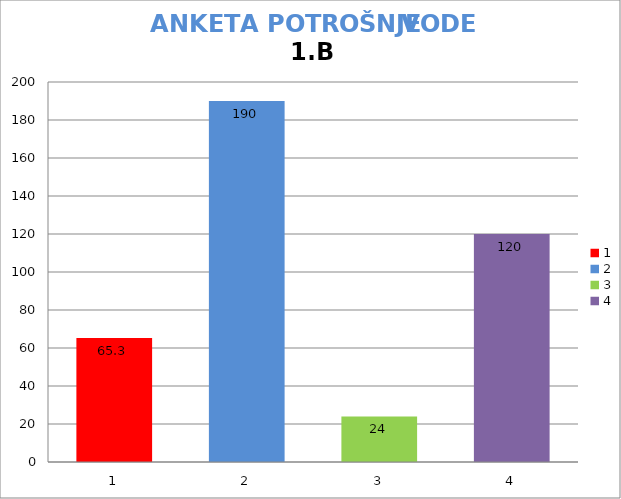
| Category | prosječna potrošnja | stvarna potrošnja | minimalna potrošnja | maksimalna potrošnja |
|---|---|---|---|---|
| 0 | 65.3 |  |  |  |
| 1 | 190 |  |  |  |
| 2 | 24 |  |  |  |
| 3 | 120 |  |  |  |